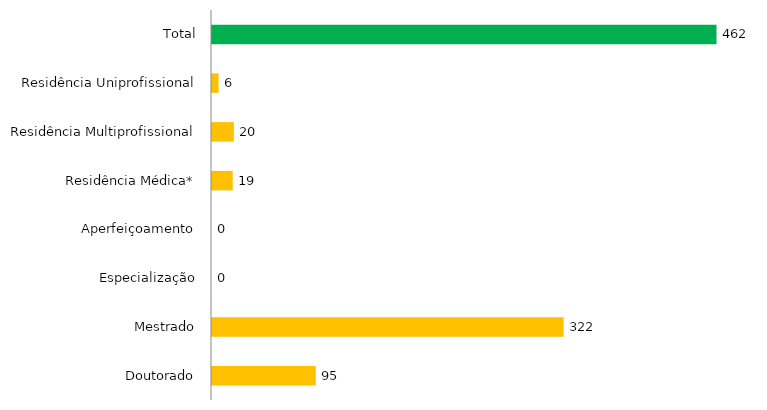
| Category | Pós - Graduação UFGD |
|---|---|
| Doutorado | 95 |
| Mestrado | 322 |
| Especialização | 0 |
| Aperfeiçoamento | 0 |
| Residência Médica* | 19 |
| Residência Multiprofissional | 20 |
| Residência Uniprofissional | 6 |
| Total | 462 |